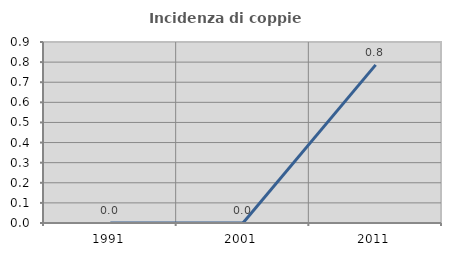
| Category | Incidenza di coppie miste |
|---|---|
| 1991.0 | 0 |
| 2001.0 | 0 |
| 2011.0 | 0.786 |